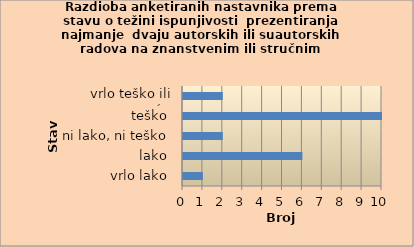
| Category | Series 0 |
|---|---|
| vrlo lako | 1 |
| lako | 6 |
| ni lako, ni teško | 2 |
| teško | 10 |
| vrlo teško ili nemoguće | 2 |